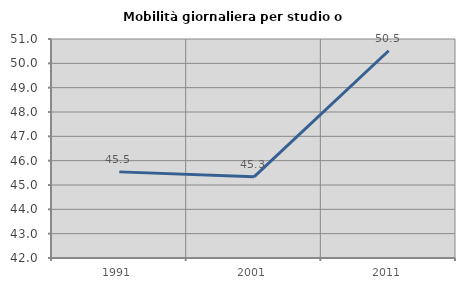
| Category | Mobilità giornaliera per studio o lavoro |
|---|---|
| 1991.0 | 45.539 |
| 2001.0 | 45.337 |
| 2011.0 | 50.517 |